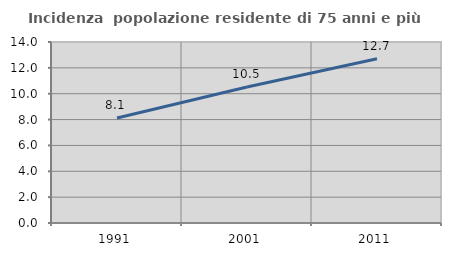
| Category | Incidenza  popolazione residente di 75 anni e più |
|---|---|
| 1991.0 | 8.125 |
| 2001.0 | 10.514 |
| 2011.0 | 12.702 |